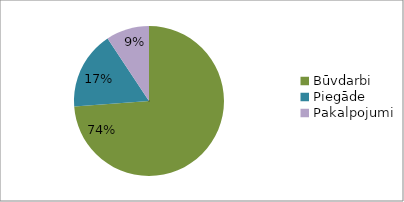
| Category | Series 0 |
|---|---|
| Būvdarbi | 0.738 |
| Piegāde | 0.168 |
| Pakalpojumi | 0.093 |